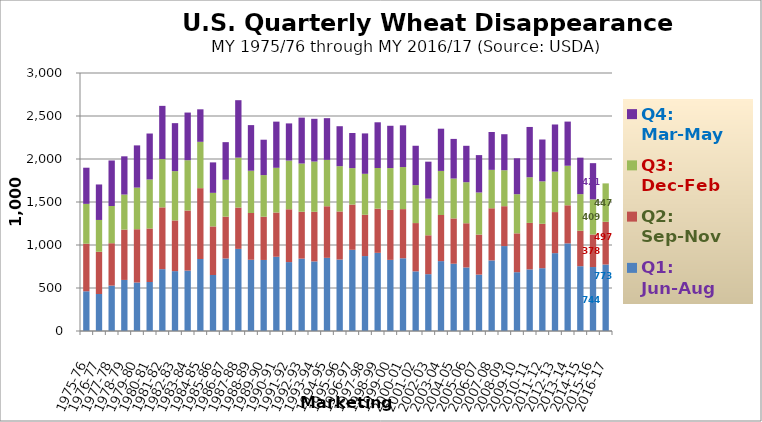
| Category | Q1: Jun-Aug | Q2: Sep-Nov | Q3: Dec-Feb | Q4: Mar-May |
|---|---|---|---|---|
| 1975-76 | 461.927 | 553.2 | 463.1 | 420.471 |
| 1976-77 | 430.009 | 491.5 | 369.7 | 412.651 |
| 1977-78 | 527.776 | 492.8 | 433.2 | 529.092 |
| 1978-79 | 593.832 | 585 | 407.9 | 444.401 |
| 1979-80 | 563.759 | 619.6 | 484 | 490.901 |
| 1980-81 | 569.733 | 622.3 | 570.1 | 534.187 |
| 1981-82 | 719.17 | 718.4 | 561.5 | 618.836 |
| 1982-83 | 696.231 | 589.5 | 573.4 | 557.737 |
| 1983-84 | 702.486 | 698.33 | 585.286 | 553.979 |
| 1984-85 | 837.127 | 823.791 | 538.819 | 377.886 |
| 1985-86 | 650.923 | 565.166 | 390.292 | 354.279 |
| 1986-87 | 843.347 | 486.654 | 429.083 | 436.813 |
| 1987-88 | 954.835 | 480.419 | 580.755 | 667.821 |
| 1988-89 | 828.077 | 543.917 | 491.853 | 530.241 |
| 1989-90 | 826.067 | 502.662 | 484.033 | 411.494 |
| 1990-91 | 863.143 | 514.543 | 520.034 | 536.786 |
| 1991-92 | 801.348 | 614.225 | 566.484 | 431.889 |
| 1992-93 | 841.391 | 545.263 | 560.798 | 533.716 |
| 1993-94 | 809.08 | 576.994 | 584.604 | 496.747 |
| 1994-95 | 850.693 | 599.813 | 539.557 | 484.764 |
| 1995-96 | 830.917 | 559.084 | 526.561 | 464.644 |
| 1996-97 | 944.063 | 526.053 | 424.074 | 407.944 |
| 1997-98 | 871.439 | 479.883 | 476.445 | 469.751 |
| 1998-99 | 908.857 | 513.563 | 472.983 | 531.464 |
| 1999-00 | 827.022 | 580.757 | 486.668 | 491.794 |
| 2000-01 | 845.627 | 571.664 | 489.127 | 485.133 |
| 2001-02 | 693.534 | 561.399 | 441.237 | 457.904 |
| 2002-03 | 660.66 | 452.205 | 425.924 | 430.159 |
| 2003-04 | 812.563 | 536.438 | 512.573 | 490.845 |
| 2004-05 | 782.237 | 526.764 | 463.709 | 460.989 |
| 2005-06 | 738.709 | 514.205 | 477.307 | 423.369 |
| 2006-07 | 655.535 | 465.343 | 489.648 | 434.789 |
| 2007-08 | 820.702 | 606.475 | 446.443 | 440.434 |
| 2008-09 | 987.595 | 463.586 | 418.426 | 418.573 |
| 2009-10 | 683.697 | 451.909 | 455.222 | 417.548 |
| 2010-11 | 716.541 | 540.434 | 530.942 | 584.663 |
| 2011-12 | 730.261 | 516.42 | 493.528 | 486.396 |
| 2012-13 | 905.329 | 477.467 | 470.444 | 548.115 |
| 2013-14 | 1018.886 | 442.811 | 459.925 | 513.43 |
| 2014-15 | 753.541 | 412.141 | 425.966 | 423.818 |
| 2015-16 | 743.757 | 378.173 | 408.742 | 420.97 |
| 2016-17 | 772.906 | 496.881 | 446.651 | 0 |